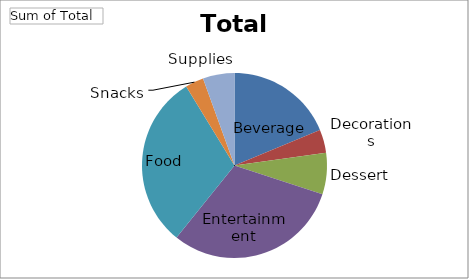
| Category | Total |
|---|---|
| Beverage | 880 |
| Decorations | 189 |
| Dessert | 339.93 |
| Entertainment | 1443 |
| Food | 1430 |
| Snacks | 151.2 |
| Supplies | 259.2 |